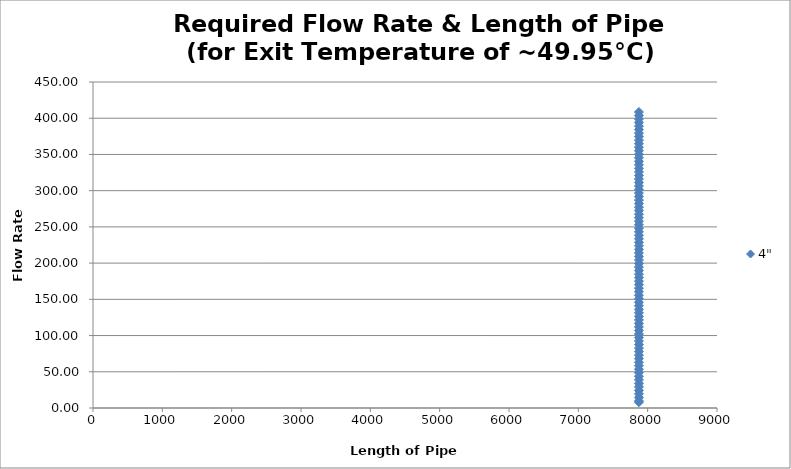
| Category | 4" |
|---|---|
| 7874.01576 | 8.026 |
| 7874.01576 | 9.729 |
| 7874.01576 | 14.593 |
| 7874.01576 | 19.458 |
| 7874.01576 | 24.322 |
| 7874.01576 | 29.186 |
| 7874.01576 | 34.051 |
| 7874.01576 | 38.915 |
| 7874.01576 | 43.78 |
| 7874.01576 | 48.644 |
| 7874.01576 | 53.508 |
| 7874.01576 | 58.373 |
| 7874.01576 | 63.237 |
| 7874.01576 | 68.101 |
| 7874.01576 | 72.966 |
| 7874.01576 | 77.83 |
| 7874.01576 | 82.695 |
| 7874.01576 | 87.559 |
| 7874.01576 | 92.423 |
| 7874.01576 | 97.288 |
| 7874.01576 | 102.152 |
| 7874.01576 | 107.017 |
| 7874.01576 | 111.881 |
| 7874.01576 | 116.745 |
| 7874.01576 | 121.61 |
| 7874.01576 | 126.474 |
| 7874.01576 | 131.339 |
| 7874.01576 | 136.203 |
| 7874.01576 | 141.067 |
| 7874.01576 | 145.932 |
| 7874.01576 | 150.796 |
| 7874.01576 | 155.661 |
| 7874.01576 | 160.525 |
| 7874.01576 | 165.389 |
| 7874.01576 | 170.254 |
| 7874.01576 | 175.118 |
| 7874.01576 | 179.982 |
| 7874.01576 | 184.847 |
| 7874.01576 | 189.711 |
| 7874.01576 | 194.576 |
| 7874.01576 | 199.44 |
| 7874.01576 | 204.304 |
| 7874.01576 | 209.169 |
| 7874.01576 | 214.033 |
| 7874.01576 | 218.898 |
| 7874.01576 | 223.762 |
| 7874.01576 | 228.626 |
| 7874.01576 | 233.491 |
| 7874.01576 | 238.355 |
| 7874.01576 | 243.22 |
| 7874.01576 | 248.084 |
| 7874.01576 | 252.948 |
| 7874.01576 | 257.813 |
| 7874.01576 | 262.677 |
| 7874.01576 | 267.542 |
| 7874.01576 | 272.406 |
| 7874.01576 | 277.27 |
| 7874.01576 | 282.135 |
| 7874.01576 | 286.999 |
| 7874.01576 | 291.864 |
| 7874.01576 | 296.728 |
| 7874.01576 | 301.592 |
| 7874.01576 | 306.457 |
| 7874.01576 | 311.321 |
| 7874.01576 | 316.185 |
| 7874.01576 | 321.05 |
| 7874.01576 | 325.914 |
| 7874.01576 | 330.779 |
| 7874.01576 | 335.643 |
| 7874.01576 | 340.507 |
| 7874.01576 | 345.372 |
| 7874.01576 | 350.236 |
| 7874.01576 | 355.101 |
| 7874.01576 | 359.965 |
| 7874.01576 | 364.829 |
| 7874.01576 | 369.694 |
| 7874.01576 | 374.558 |
| 7874.01576 | 379.423 |
| 7874.01576 | 384.287 |
| 7874.01576 | 389.151 |
| 7874.01576 | 394.016 |
| 7874.01576 | 398.88 |
| 7874.01576 | 403.745 |
| 7874.01576 | 408.609 |